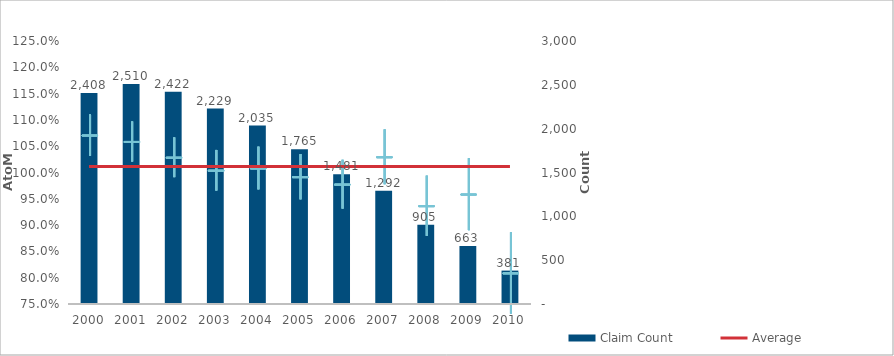
| Category | Claim Count |
|---|---|
| 0 | 2408 |
| 1 | 2510 |
| 2 | 2422 |
| 3 | 2229 |
| 4 | 2035 |
| 5 | 1765 |
| 6 | 1481 |
| 7 | 1292 |
| 8 | 905 |
| 9 | 663 |
| 10 | 381 |